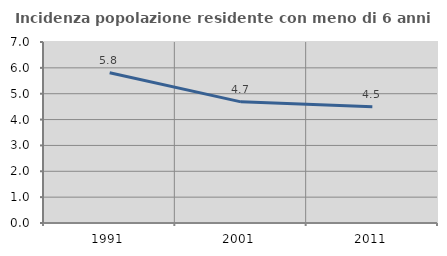
| Category | Incidenza popolazione residente con meno di 6 anni |
|---|---|
| 1991.0 | 5.809 |
| 2001.0 | 4.685 |
| 2011.0 | 4.498 |